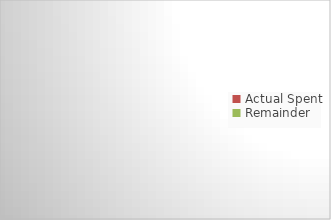
| Category | Series 0 |
|---|---|
| Actual Spent | 0 |
| Remainder | 0 |